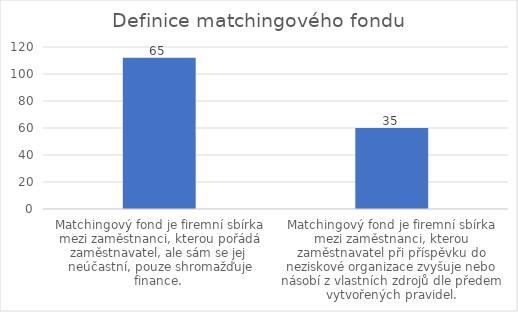
| Category | Počet respondentů |
|---|---|
| Matchingový fond je firemní sbírka mezi zaměstnanci, kterou pořádá zaměstnavatel, ale sám se jej neúčastní, pouze shromažďuje finance.  | 112 |
| Matchingový fond je firemní sbírka mezi zaměstnanci, kterou zaměstnavatel při příspěvku do neziskové organizace zvyšuje nebo násobí z vlastních zdrojů dle předem vytvořených pravidel. | 60 |